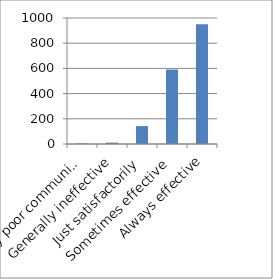
| Category | Series 0 |
|---|---|
| Very poor communication | 4 |
| Generally ineffective | 11 |
| Just satisfactorily | 142 |
| Sometimes effective | 591 |
| Always effective | 950 |